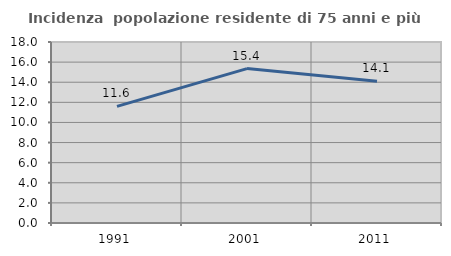
| Category | Incidenza  popolazione residente di 75 anni e più |
|---|---|
| 1991.0 | 11.603 |
| 2001.0 | 15.355 |
| 2011.0 | 14.101 |